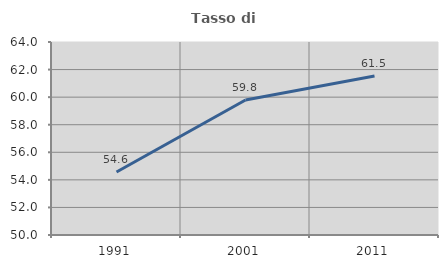
| Category | Tasso di occupazione   |
|---|---|
| 1991.0 | 54.566 |
| 2001.0 | 59.797 |
| 2011.0 | 61.536 |